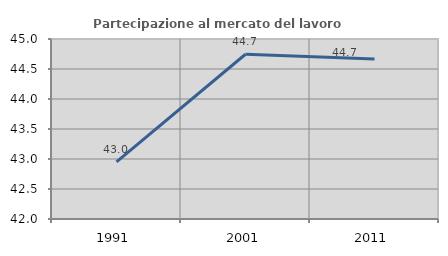
| Category | Partecipazione al mercato del lavoro  femminile |
|---|---|
| 1991.0 | 42.951 |
| 2001.0 | 44.746 |
| 2011.0 | 44.667 |